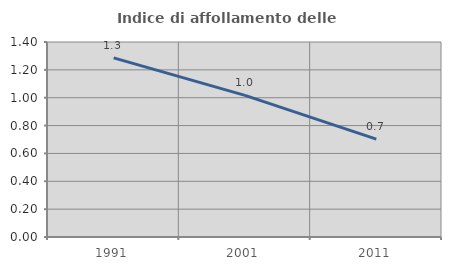
| Category | Indice di affollamento delle abitazioni  |
|---|---|
| 1991.0 | 1.286 |
| 2001.0 | 1.016 |
| 2011.0 | 0.703 |